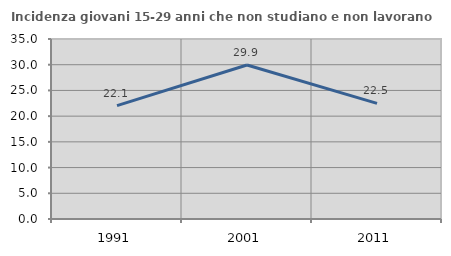
| Category | Incidenza giovani 15-29 anni che non studiano e non lavorano  |
|---|---|
| 1991.0 | 22.055 |
| 2001.0 | 29.934 |
| 2011.0 | 22.481 |